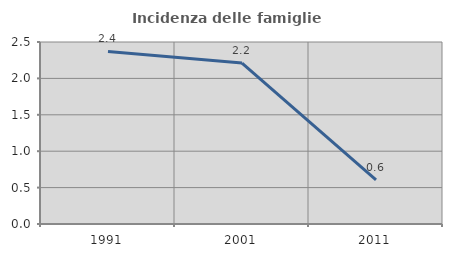
| Category | Incidenza delle famiglie numerose |
|---|---|
| 1991.0 | 2.371 |
| 2001.0 | 2.21 |
| 2011.0 | 0.606 |